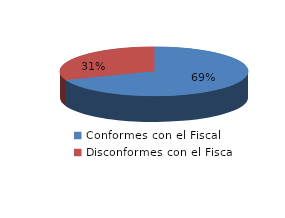
| Category | Series 0 |
|---|---|
| 0 | 249 |
| 1 | 111 |